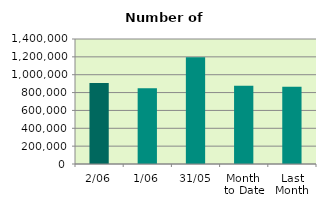
| Category | Series 0 |
|---|---|
| 2/06 | 906248 |
| 1/06 | 848572 |
| 31/05 | 1194208 |
| Month 
to Date | 877410 |
| Last
Month | 864947.182 |